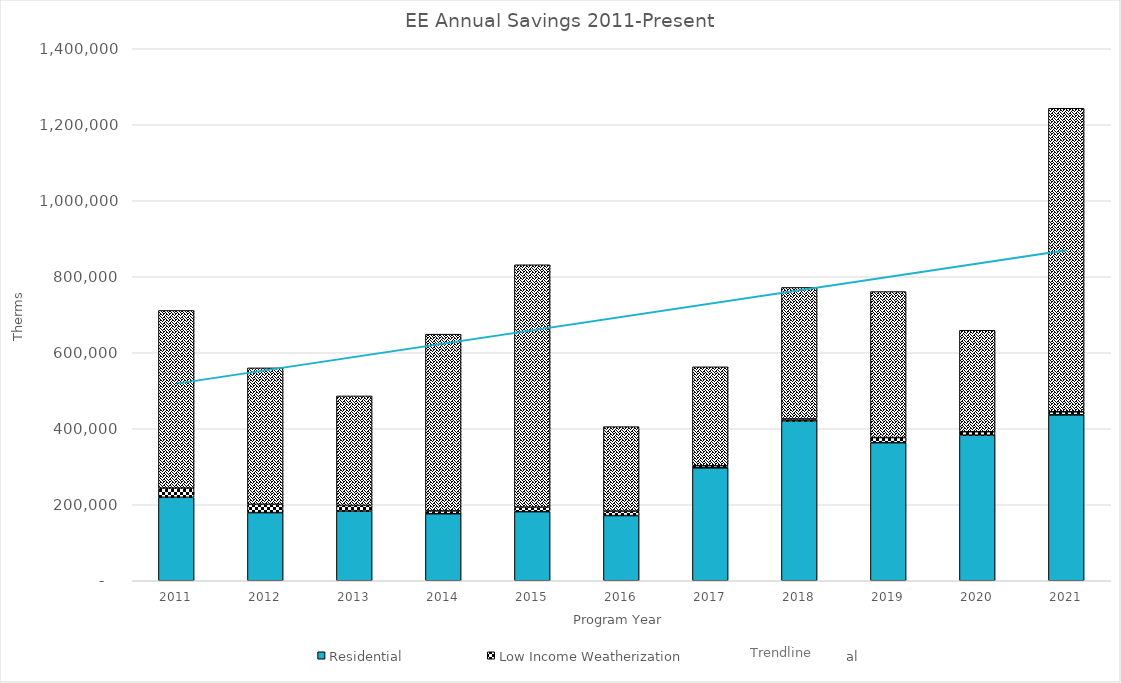
| Category | Residential | Low Income Weatherization | Commercial |
|---|---|---|---|
| 2011.0 | 219596 | 24130 | 467657 |
| 2012.0 | 179330 | 21824 | 359003 |
| 2013.0 | 183352 | 14960 | 288079 |
| 2014.0 | 176439 | 7338 | 465176 |
| 2015.0 | 181847 | 11724 | 637930 |
| 2016.0 | 171620 | 11743 | 222194 |
| 2017.0 | 297216 | 5564 | 260176 |
| 2018.0 | 420639 | 5181 | 345999 |
| 2019.0 | 363364 | 13416 | 384176 |
| 2020.0 | 383018 | 9213 | 266945 |
| 2021.0 | 436553 | 8076 | 798874 |